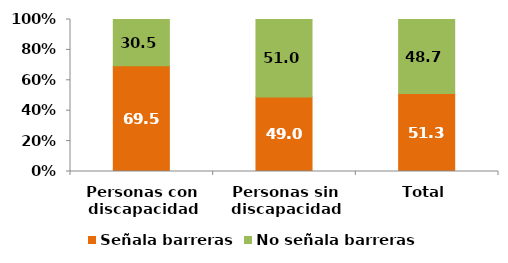
| Category | Señala barreras | No señala barreras |
|---|---|---|
| Personas con discapacidad | 69.512 | 30.488 |
| Personas sin discapacidad | 48.956 | 51.044 |
| Total | 51.281 | 48.719 |